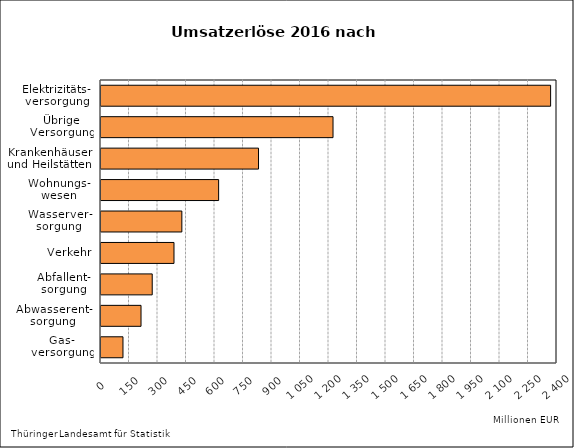
| Category | Series 1 |
|---|---|
| Gas-
versorgung | 115.638 |
| Abwasserent-
sorgung | 210.689 |
| Abfallent-
sorgung | 269.627 |
| Verkehr | 384.208 |
| Wasserver-
sorgung | 425.544 |
| Wohnungs-
wesen | 619.151 |
| Krankenhäuser
und Heilstätten | 829.039 |
| Übrige
Versorgung | 1221.201 |
| Elektrizitäts-
versorgung | 2366.377 |